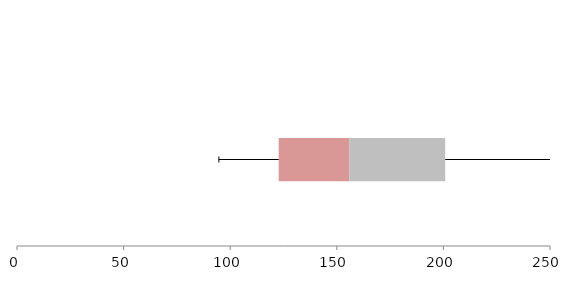
| Category | Series 1 | Series 2 | Series 3 |
|---|---|---|---|
| 0 | 122.745 | 33.081 | 45.034 |